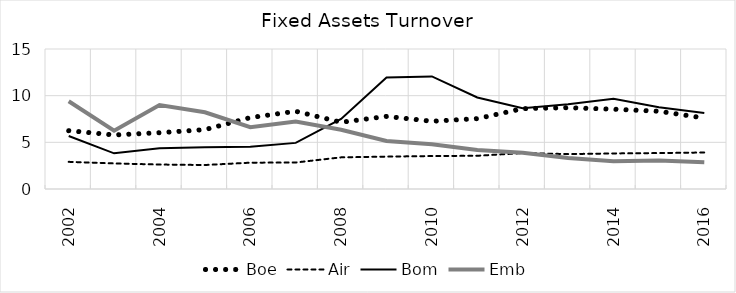
| Category | Boe | Air | Bom | Emb |
|---|---|---|---|---|
| 2002.0 | 6.25 | 2.91 | 5.68 | 9.4 |
| 2003.0 | 5.79 | 2.74 | 3.82 | 6.24 |
| 2004.0 | 6.03 | 2.62 | 4.37 | 9 |
| 2005.0 | 6.36 | 2.57 | 4.48 | 8.22 |
| 2006.0 | 7.65 | 2.82 | 4.53 | 6.63 |
| 2007.0 | 8.33 | 2.84 | 4.94 | 7.23 |
| 2008.0 | 7.15 | 3.39 | 7.5 | 6.35 |
| 2009.0 | 7.78 | 3.47 | 11.95 | 5.15 |
| 2010.0 | 7.26 | 3.53 | 12.06 | 4.79 |
| 2011.0 | 7.54 | 3.56 | 9.81 | 4.17 |
| 2012.0 | 8.61 | 3.85 | 8.65 | 3.88 |
| 2013.0 | 8.71 | 3.74 | 9.08 | 3.32 |
| 2014.0 | 8.55 | 3.81 | 9.67 | 2.97 |
| 2015.0 | 8.33 | 3.85 | 8.75 | 3.05 |
| 2016.0 | 7.6 | 3.91 | 8.15 | 2.87 |